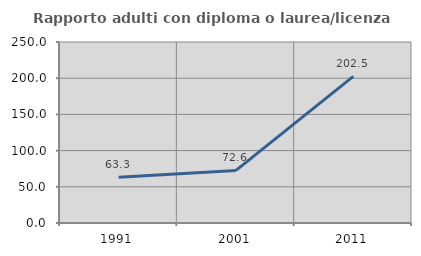
| Category | Rapporto adulti con diploma o laurea/licenza media  |
|---|---|
| 1991.0 | 63.278 |
| 2001.0 | 72.601 |
| 2011.0 | 202.506 |